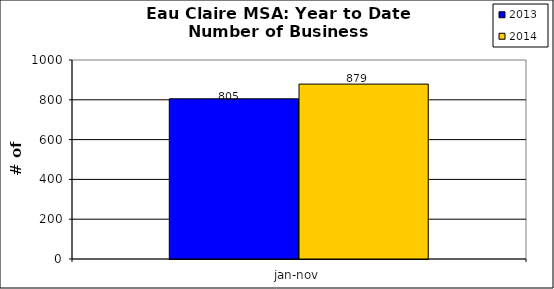
| Category | 2013 | 2014 |
|---|---|---|
| 0 | 805 | 879 |